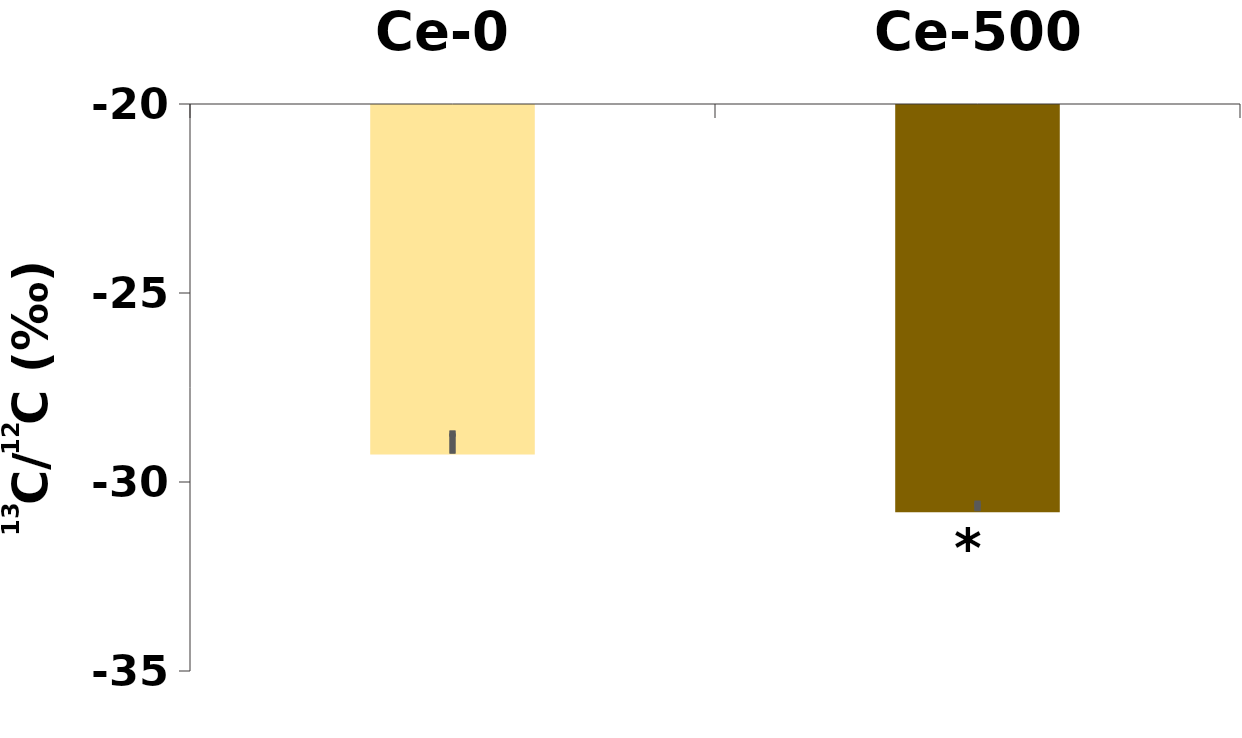
| Category | δ13C |
|---|---|
| Ce-0 | -29.248 |
| Ce-500 | -30.771 |